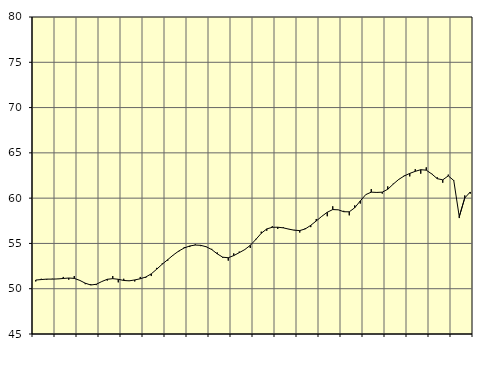
| Category | Piggar | Samtliga anställda (inkl. anställda utomlands) |
|---|---|---|
| nan | 50.8 | 50.96 |
| 1.0 | 51.1 | 51.01 |
| 1.0 | 51 | 51.06 |
| 1.0 | 51.1 | 51.06 |
| nan | 51.1 | 51.08 |
| 2.0 | 51.3 | 51.13 |
| 2.0 | 51 | 51.18 |
| 2.0 | 51.4 | 51.14 |
| nan | 50.9 | 50.92 |
| 3.0 | 50.5 | 50.61 |
| 3.0 | 50.5 | 50.41 |
| 3.0 | 50.4 | 50.49 |
| nan | 50.8 | 50.79 |
| 4.0 | 50.9 | 51.04 |
| 4.0 | 51.4 | 51.11 |
| 4.0 | 50.7 | 51.04 |
| nan | 51.1 | 50.91 |
| 5.0 | 50.9 | 50.87 |
| 5.0 | 50.8 | 50.97 |
| 5.0 | 51.3 | 51.1 |
| nan | 51.2 | 51.29 |
| 6.0 | 51.4 | 51.64 |
| 6.0 | 52.3 | 52.16 |
| 6.0 | 52.8 | 52.71 |
| nan | 53.1 | 53.21 |
| 7.0 | 53.7 | 53.72 |
| 7.0 | 54.1 | 54.16 |
| 7.0 | 54.6 | 54.5 |
| nan | 54.6 | 54.72 |
| 8.0 | 54.9 | 54.82 |
| 8.0 | 54.7 | 54.79 |
| 8.0 | 54.6 | 54.63 |
| nan | 54.4 | 54.32 |
| 9.0 | 54 | 53.85 |
| 9.0 | 53.4 | 53.48 |
| 9.0 | 53.1 | 53.42 |
| nan | 53.9 | 53.66 |
| 10.0 | 54.1 | 53.98 |
| 10.0 | 54.3 | 54.32 |
| 10.0 | 54.5 | 54.79 |
| nan | 55.5 | 55.43 |
| 11.0 | 56.3 | 56.12 |
| 11.0 | 56.4 | 56.6 |
| 11.0 | 56.9 | 56.78 |
| nan | 56.6 | 56.79 |
| 12.0 | 56.8 | 56.72 |
| 12.0 | 56.6 | 56.58 |
| 12.0 | 56.5 | 56.46 |
| nan | 56.2 | 56.42 |
| 13.0 | 56.7 | 56.6 |
| 13.0 | 56.8 | 57 |
| 13.0 | 57.7 | 57.48 |
| nan | 58 | 57.99 |
| 14.0 | 58 | 58.44 |
| 14.0 | 59.1 | 58.74 |
| 14.0 | 58.7 | 58.71 |
| nan | 58.6 | 58.5 |
| 15.0 | 58.1 | 58.49 |
| 15.0 | 59.2 | 58.94 |
| 15.0 | 59.4 | 59.69 |
| nan | 60.4 | 60.39 |
| 16.0 | 61 | 60.66 |
| 16.0 | 60.6 | 60.63 |
| 16.0 | 60.5 | 60.66 |
| nan | 61.3 | 60.98 |
| 17.0 | 61.6 | 61.55 |
| 17.0 | 62.1 | 62.07 |
| 17.0 | 62.5 | 62.45 |
| nan | 62.4 | 62.73 |
| 18.0 | 63.2 | 62.96 |
| 18.0 | 62.7 | 63.14 |
| 18.0 | 63.4 | 63.09 |
| nan | 62.7 | 62.67 |
| 19.0 | 62.3 | 62.15 |
| 19.0 | 61.7 | 62.02 |
| 19.0 | 62.6 | 62.46 |
| nan | 61.9 | 61.95 |
| 20.0 | 57.8 | 57.95 |
| 20.0 | 60.3 | 60.02 |
| 20.0 | 60.5 | 60.68 |